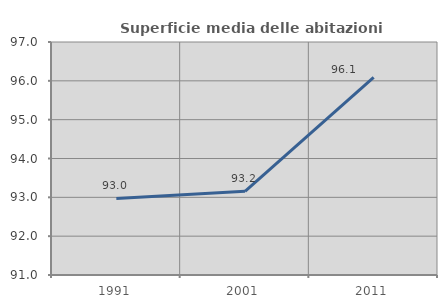
| Category | Superficie media delle abitazioni occupate |
|---|---|
| 1991.0 | 92.97 |
| 2001.0 | 93.154 |
| 2011.0 | 96.088 |